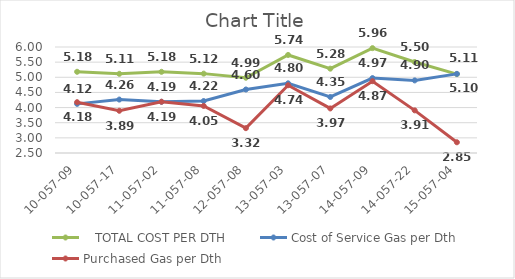
| Category |    TOTAL COST PER DTH | Cost of Service Gas per Dth | Purchased Gas per Dth |
|---|---|---|---|
| 10-057-09 | 5.182 | 4.122 | 4.178 |
| 10-057-17 | 5.115 | 4.265 | 3.895 |
| 11-057-02 | 5.181 | 4.19 | 4.193 |
| 11-057-08 | 5.121 | 4.215 | 4.054 |
| 12-057-08 | 4.985 | 4.596 | 3.32 |
| 13-057-03 | 5.737 | 4.8 | 4.737 |
| 13-057-07 | 5.285 | 4.35 | 3.972 |
| 14-057-09 | 5.963 | 4.974 | 4.871 |
| 14-057-22 | 5.503 | 4.897 | 3.908 |
| 15-057-04 | 5.104 | 5.113 | 2.854 |